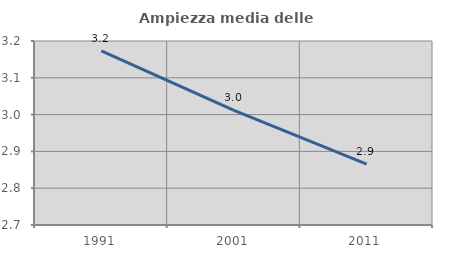
| Category | Ampiezza media delle famiglie |
|---|---|
| 1991.0 | 3.173 |
| 2001.0 | 3.011 |
| 2011.0 | 2.865 |